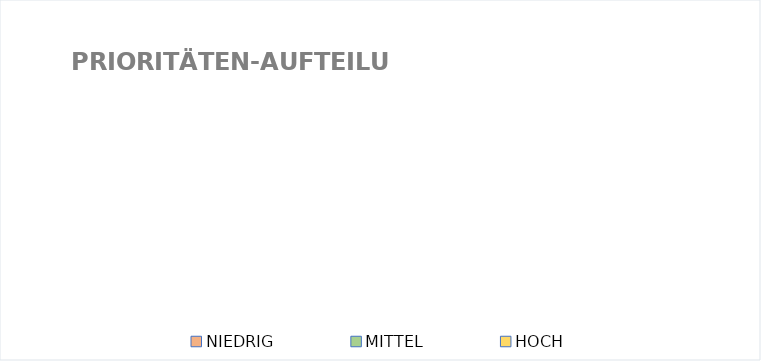
| Category | Series 0 |
|---|---|
| NIEDRIG | 0 |
| MITTEL | 0 |
| HOCH | 0 |